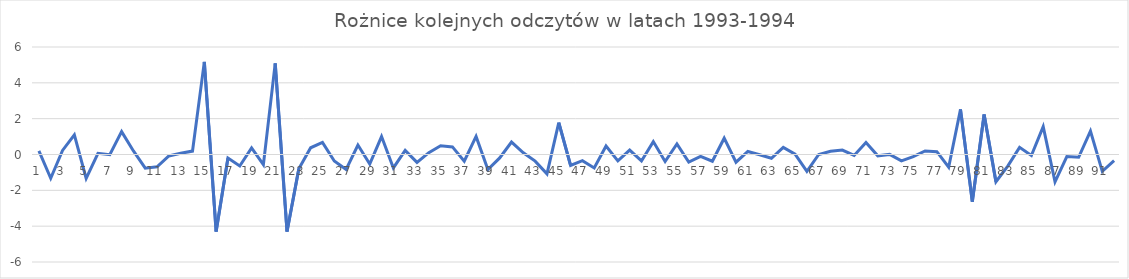
| Category | Series 0 |
|---|---|
| 0 | 0.2 |
| 1 | -1.325 |
| 2 | 0.225 |
| 3 | 1.1 |
| 4 | -1.34 |
| 5 | 0.07 |
| 6 | -0.007 |
| 7 | 1.277 |
| 8 | 0.2 |
| 9 | -0.76 |
| 10 | -0.69 |
| 11 | -0.082 |
| 12 | 0.072 |
| 13 | 0.19 |
| 14 | 5.17 |
| 15 | -4.3 |
| 16 | -0.2 |
| 17 | -0.64 |
| 18 | 0.37 |
| 19 | -0.57 |
| 20 | 5.09 |
| 21 | -4.3 |
| 22 | -0.8 |
| 23 | 0.376 |
| 24 | 0.674 |
| 25 | -0.366 |
| 26 | -0.834 |
| 27 | 0.53 |
| 28 | -0.53 |
| 29 | 1 |
| 30 | -0.75 |
| 31 | 0.232 |
| 32 | -0.442 |
| 33 | 0.1 |
| 34 | 0.485 |
| 35 | 0.425 |
| 36 | -0.37 |
| 37 | 1.01 |
| 38 | -0.84 |
| 39 | -0.19 |
| 40 | 0.693 |
| 41 | 0.097 |
| 42 | -0.37 |
| 43 | -1.08 |
| 44 | 1.775 |
| 45 | -0.61 |
| 46 | -0.342 |
| 47 | -0.748 |
| 48 | 0.475 |
| 49 | -0.355 |
| 50 | 0.245 |
| 51 | -0.36 |
| 52 | 0.72 |
| 53 | -0.39 |
| 54 | 0.585 |
| 55 | -0.419 |
| 56 | -0.101 |
| 57 | -0.375 |
| 58 | 0.91 |
| 59 | -0.43 |
| 60 | 0.17 |
| 61 | -0.017 |
| 62 | -0.21 |
| 63 | 0.397 |
| 64 | 0.02 |
| 65 | -0.94 |
| 66 | 0 |
| 67 | 0.18 |
| 68 | 0.25 |
| 69 | -0.05 |
| 70 | 0.665 |
| 71 | -0.075 |
| 72 | 0.005 |
| 73 | -0.355 |
| 74 | -0.12 |
| 75 | 0.2 |
| 76 | 0.16 |
| 77 | -0.71 |
| 78 | 2.517 |
| 79 | -2.633 |
| 80 | 2.237 |
| 81 | -1.52 |
| 82 | -0.65 |
| 83 | 0.4 |
| 84 | -0.055 |
| 85 | 1.555 |
| 86 | -1.53 |
| 87 | -0.117 |
| 88 | -0.153 |
| 89 | 1.31 |
| 90 | -0.943 |
| 91 | -0.347 |